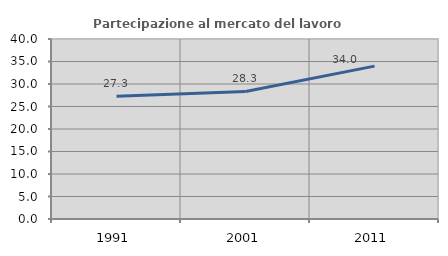
| Category | Partecipazione al mercato del lavoro  femminile |
|---|---|
| 1991.0 | 27.273 |
| 2001.0 | 28.346 |
| 2011.0 | 33.978 |